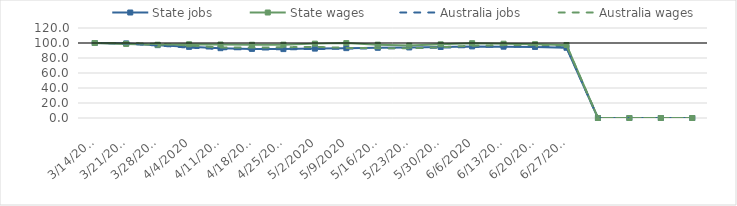
| Category | State jobs | State wages | Australia jobs | Australia wages |
|---|---|---|---|---|
| 14/03/2020 | 100 | 100 | 100 | 100 |
| 21/03/2020 | 99.445 | 98.808 | 99.389 | 100.07 |
| 28/03/2020 | 97.136 | 97.707 | 96.608 | 98.707 |
| 04/04/2020 | 94.853 | 98.33 | 93.828 | 96.765 |
| 11/04/2020 | 93.099 | 97.978 | 91.887 | 94.047 |
| 18/04/2020 | 92.137 | 97.669 | 91.31 | 93.932 |
| 25/04/2020 | 91.862 | 97.804 | 91.6 | 94.326 |
| 02/05/2020 | 92.524 | 99.167 | 91.954 | 94.889 |
| 09/05/2020 | 93.163 | 99.886 | 92.449 | 93.491 |
| 16/05/2020 | 93.593 | 97.771 | 92.97 | 93.144 |
| 23/05/2020 | 94.074 | 96.512 | 93.251 | 92.924 |
| 30/05/2020 | 94.694 | 98.225 | 93.813 | 94.361 |
| 06/06/2020 | 95.462 | 99.734 | 94.668 | 96.401 |
| 13/06/2020 | 95.096 | 99.081 | 95.11 | 97.158 |
| 20/06/2020 | 94.751 | 98.383 | 95.246 | 97.537 |
| 27/06/2020 | 93.656 | 97.335 | 94.328 | 96.826 |